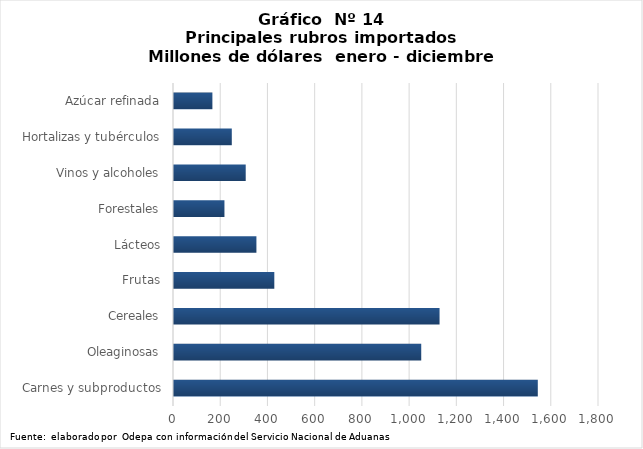
| Category | Series 0 |
|---|---|
| Carnes y subproductos | 1540792.97 |
| Oleaginosas | 1047114.474 |
| Cereales | 1124727.109 |
| Frutas | 424859.384 |
| Lácteos | 349072.925 |
| Forestales | 213653 |
| Vinos y alcoholes | 303748.629 |
| Hortalizas y tubérculos | 244779.841 |
| Azúcar refinada | 162612.198 |